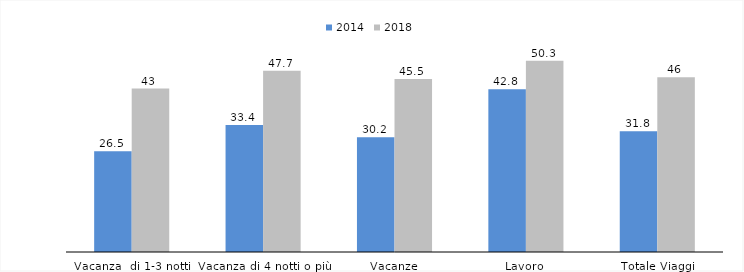
| Category | 2014 | 2018 |
|---|---|---|
| Vacanza  di 1-3 notti | 26.5 | 43 |
| Vacanza di 4 notti o più | 33.4 | 47.7 |
| Vacanze | 30.2 | 45.5 |
| Lavoro | 42.8 | 50.3 |
| Totale Viaggi | 31.8 | 46 |